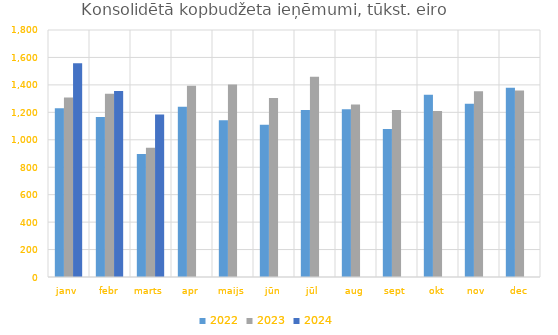
| Category | 2022 | 2023 | 2024 |
|---|---|---|---|
| janv | 1230170.047 | 1307495.685 | 1557359.802 |
| febr | 1166379.907 | 1335076.73 | 1355056.454 |
| marts | 896198.796 | 941933.145 | 1183497.744 |
| apr | 1240480.294 | 1392983.428 | 0 |
| maijs | 1141583.555 | 1402498.183 | 0 |
| jūn | 1110073.881 | 1304045.598 | 0 |
| jūl | 1217508.617 | 1459749.866 | 0 |
| aug | 1222030.584 | 1257876.494 | 0 |
| sept | 1079167.695 | 1217869.498 | 0 |
| okt | 1328712.607 | 1209805.903 | 0 |
| nov | 1261934.438 | 1354090.244 | 0 |
| dec | 1379607.658 | 1358321.803 | 0 |